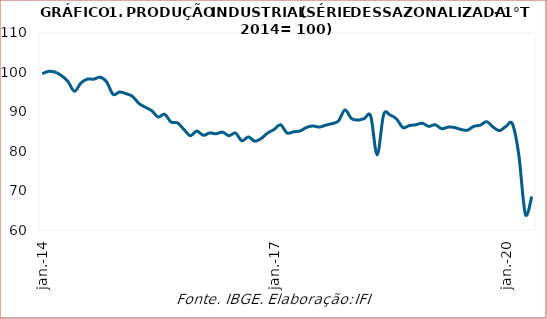
| Category | Produção industrial |
|---|---|
| 2014-01-01 | 99.67 |
| 2014-02-01 | 100.264 |
| 2014-03-01 | 100.066 |
| 2014-04-01 | 99.175 |
| 2014-05-01 | 97.691 |
| 2014-06-01 | 95.216 |
| 2014-07-01 | 97.295 |
| 2014-08-01 | 98.284 |
| 2014-09-01 | 98.284 |
| 2014-10-01 | 98.779 |
| 2014-11-01 | 97.592 |
| 2014-12-01 | 94.424 |
| 2015-01-01 | 95.018 |
| 2015-02-01 | 94.622 |
| 2015-03-01 | 93.929 |
| 2015-04-01 | 92.148 |
| 2015-05-01 | 91.158 |
| 2015-06-01 | 90.267 |
| 2015-07-01 | 88.684 |
| 2015-08-01 | 89.376 |
| 2015-09-01 | 87.397 |
| 2015-10-01 | 87.199 |
| 2015-11-01 | 85.516 |
| 2015-12-01 | 83.933 |
| 2016-01-01 | 85.12 |
| 2016-02-01 | 84.032 |
| 2016-03-01 | 84.626 |
| 2016-04-01 | 84.428 |
| 2016-05-01 | 84.823 |
| 2016-06-01 | 83.933 |
| 2016-07-01 | 84.626 |
| 2016-08-01 | 82.646 |
| 2016-09-01 | 83.636 |
| 2016-10-01 | 82.547 |
| 2016-11-01 | 83.24 |
| 2016-12-01 | 84.626 |
| 2017-01-01 | 85.516 |
| 2017-02-01 | 86.704 |
| 2017-03-01 | 84.626 |
| 2017-04-01 | 84.922 |
| 2017-05-01 | 85.12 |
| 2017-06-01 | 86.011 |
| 2017-07-01 | 86.407 |
| 2017-08-01 | 86.11 |
| 2017-09-01 | 86.605 |
| 2017-10-01 | 87.001 |
| 2017-11-01 | 87.694 |
| 2017-12-01 | 90.465 |
| 2018-01-01 | 88.288 |
| 2018-02-01 | 87.892 |
| 2018-03-01 | 88.288 |
| 2018-04-01 | 88.882 |
| 2018-05-01 | 79.083 |
| 2018-06-01 | 89.277 |
| 2018-07-01 | 89.178 |
| 2018-08-01 | 88.189 |
| 2018-09-01 | 86.011 |
| 2018-10-01 | 86.506 |
| 2018-11-01 | 86.704 |
| 2018-12-01 | 87.1 |
| 2019-01-01 | 86.308 |
| 2019-02-01 | 86.704 |
| 2019-03-01 | 85.714 |
| 2019-04-01 | 86.11 |
| 2019-05-01 | 86.011 |
| 2019-06-01 | 85.516 |
| 2019-07-01 | 85.318 |
| 2019-08-01 | 86.308 |
| 2019-09-01 | 86.605 |
| 2019-10-01 | 87.496 |
| 2019-11-01 | 86.11 |
| 2019-12-01 | 85.219 |
| 2020-01-01 | 86.308 |
| 2020-02-01 | 86.902 |
| 2020-03-01 | 78.885 |
| 2020-04-01 | 64.038 |
| 2020-05-01 | 68.492 |